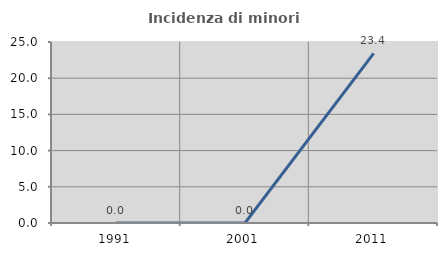
| Category | Incidenza di minori stranieri |
|---|---|
| 1991.0 | 0 |
| 2001.0 | 0 |
| 2011.0 | 23.438 |